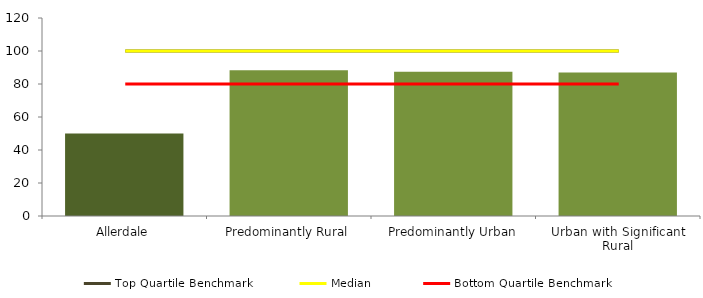
| Category | Series 0 |
|---|---|
| Allerdale | 50 |
| Predominantly Rural | 88.39 |
| Predominantly Urban | 87.36 |
| Urban with Significant Rural | 86.999 |